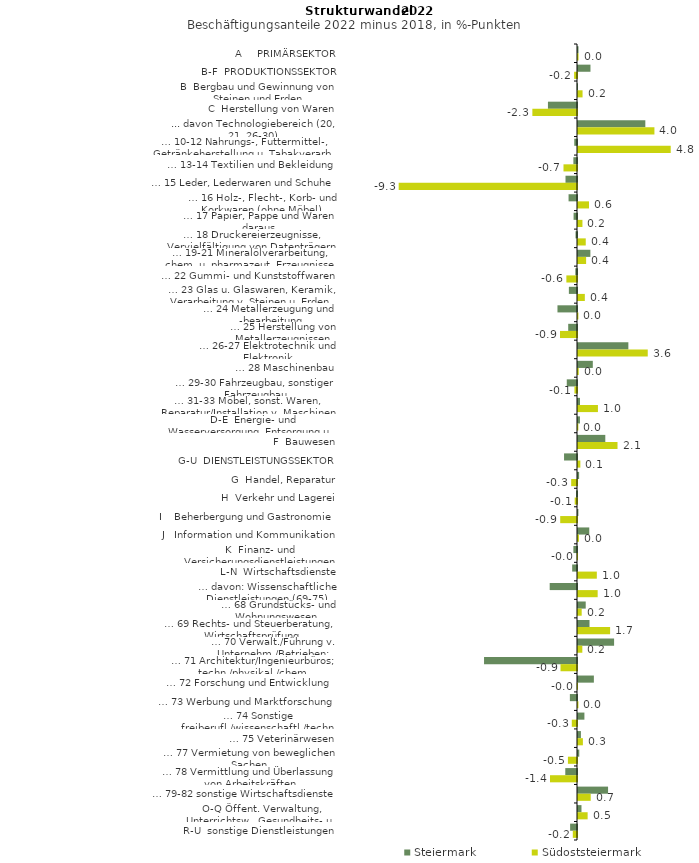
| Category | Steiermark | Südoststeiermark |
|---|---|---|
| A     PRIMÄRSEKTOR | 0.025 | 0.028 |
| B-F  PRODUKTIONSSEKTOR | 0.65 | -0.151 |
| B  Bergbau und Gewinnung von Steinen und Erden | -0.011 | 0.238 |
| C  Herstellung von Waren | -1.516 | -2.329 |
| ... davon Technologiebereich (20, 21, 26-30) | 3.513 | 3.987 |
| … 10-12 Nahrungs-, Futtermittel-, Getränkeherstellung u. Tabakverarb. | -0.143 | 4.838 |
| … 13-14 Textilien und Bekleidung | -0.189 | -0.705 |
| … 15 Leder, Lederwaren und Schuhe | -0.6 | -9.303 |
| … 16 Holz-, Flecht-, Korb- und Korkwaren (ohne Möbel)  | -0.44 | 0.573 |
| … 17 Papier, Pappe und Waren daraus  | -0.178 | 0.232 |
| … 18 Druckereierzeugnisse, Vervielfältigung von Datenträgern | -0.077 | 0.404 |
| … 19-21 Mineralölverarbeitung, chem. u. pharmazeut. Erzeugnisse | 0.646 | 0.423 |
| … 22 Gummi- und Kunststoffwaren | -0.089 | -0.555 |
| … 23 Glas u. Glaswaren, Keramik, Verarbeitung v. Steinen u. Erden  | -0.424 | 0.357 |
| … 24 Metallerzeugung und -bearbeitung | -1.019 | 0.02 |
| … 25 Herstellung von Metallerzeugnissen  | -0.459 | -0.888 |
| … 26-27 Elektrotechnik und Elektronik | 2.628 | 3.639 |
| … 28 Maschinenbau | 0.773 | 0.039 |
| … 29-30 Fahrzeugbau, sonstiger Fahrzeugbau | -0.534 | -0.133 |
| … 31-33 Möbel, sonst. Waren, Reparatur/Installation v. Maschinen | 0.106 | 1.04 |
| D-E  Energie- und Wasserversorgung, Entsorgung u. Rückgewinnung | 0.102 | 0.018 |
| F  Bauwesen | 1.424 | 2.062 |
| G-U  DIENSTLEISTUNGSSEKTOR | -0.676 | 0.122 |
| G  Handel, Reparatur | 0.059 | -0.304 |
| H  Verkehr und Lagerei | -0.05 | -0.12 |
| I    Beherbergung und Gastronomie | 0.02 | -0.876 |
| J   Information und Kommunikation | 0.588 | 0.049 |
| K  Finanz- und Versicherungsdienstleistungen | -0.188 | -0.014 |
| L-N  Wirtschaftsdienste | -0.252 | 0.982 |
| … davon: Wissenschaftliche Dienstleistungen (69-75) | -1.425 | 1.026 |
| … 68 Grundstücks- und Wohnungswesen  | 0.402 | 0.193 |
| … 69 Rechts- und Steuerberatung, Wirtschaftsprüfung | 0.6 | 1.675 |
| … 70 Verwalt./Führung v. Unternehm./Betrieben; Unternehmensberat. | 1.883 | 0.226 |
| … 71 Architektur/Ingenieurbüros; techn./physikal./chem. Untersuchung | -4.85 | -0.861 |
| … 72 Forschung und Entwicklung  | 0.828 | -0.01 |
| … 73 Werbung und Marktforschung | -0.372 | 0.022 |
| … 74 Sonstige freiberufl./wissenschaftl./techn. Tätigkeiten | 0.334 | -0.273 |
| … 75 Veterinärwesen | 0.152 | 0.255 |
| … 77 Vermietung von beweglichen Sachen  | 0.067 | -0.474 |
| … 78 Vermittlung und Überlassung von Arbeitskräften | -0.611 | -1.408 |
| … 79-82 sonstige Wirtschaftsdienste | 1.569 | 0.664 |
| O-Q Öffent. Verwaltung, Unterrichtsw., Gesundheits- u. Sozialwesen | 0.182 | 0.503 |
| R-U  sonstige Dienstleistungen | -0.359 | -0.219 |